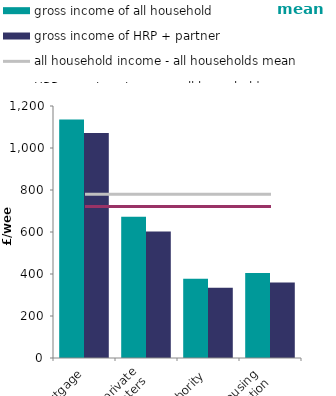
| Category | gross income of all household | gross income of HRP + partner |
|---|---|---|
| buying with mortgage | 1136.012 | 1070.838 |
| private
renters | 672.98 | 601.812 |
| local authority | 377.402 | 334.471 |
| housing 
association | 405.125 | 359.646 |